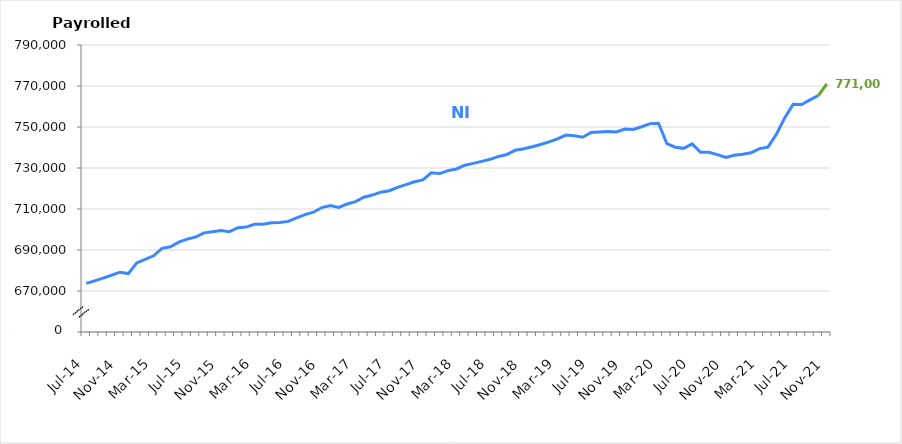
| Category | NI |
|---|---|
| Jul-14 | 673703 |
| Aug-14 | 674930 |
| Sep-14 | 676249 |
| Oct-14 | 677675 |
| Nov-14 | 679171 |
| Dec-14 | 678496 |
| Jan-15 | 683704 |
| Feb-15 | 685455 |
| Mar-15 | 687153 |
| Apr-15 | 690822 |
| May-15 | 691577 |
| Jun-15 | 693850 |
| Jul-15 | 695287 |
| Aug-15 | 696341 |
| Sep-15 | 698351 |
| Oct-15 | 698898 |
| Nov-15 | 699498 |
| Dec-15 | 698883 |
| Jan-16 | 700820 |
| Feb-16 | 701162 |
| Mar-16 | 702517 |
| Apr-16 | 702549 |
| May-16 | 703253 |
| Jun-16 | 703400 |
| Jul-16 | 703961 |
| Aug-16 | 705719 |
| Sep-16 | 707272 |
| Oct-16 | 708427 |
| Nov-16 | 710712 |
| Dec-16 | 711656 |
| Jan-17 | 710777 |
| Feb-17 | 712431 |
| Mar-17 | 713578 |
| Apr-17 | 715750 |
| May-17 | 716805 |
| Jun-17 | 718207 |
| Jul-17 | 718918 |
| Aug-17 | 720530 |
| Sep-17 | 721855 |
| Oct-17 | 723308 |
| Nov-17 | 724206 |
| Dec-17 | 727624 |
| Jan-18 | 727293 |
| Feb-18 | 728735 |
| Mar-18 | 729535 |
| Apr-18 | 731378 |
| May-18 | 732262 |
| Jun-18 | 733245 |
| Jul-18 | 734239 |
| Aug-18 | 735642 |
| Sep-18 | 736602 |
| Oct-18 | 738645 |
| Nov-18 | 739418 |
| Dec-18 | 740382 |
| Jan-19 | 741438 |
| Feb-19 | 742765 |
| Mar-19 | 744221 |
| Apr-19 | 746083 |
| May-19 | 745744 |
| Jun-19 | 744977 |
| Jul-19 | 747344 |
| Aug-19 | 747577 |
| Sep-19 | 747805 |
| Oct-19 | 747584 |
| Nov-19 | 748963 |
| Dec-19 | 748818 |
| Jan-20 | 750122 |
| Feb-20 | 751649 |
| Mar-20 | 751857 |
| Apr-20 | 741882 |
| May-20 | 740158 |
| Jun-20 | 739595 |
| Jul-20 | 741784 |
| Aug-20 | 737710 |
| Sep-20 | 737686 |
| Oct-20 | 736549 |
| Nov-20 | 735192 |
| Dec-20 | 736209 |
| Jan-21 | 736720 |
| Feb-21 | 737401 |
| Mar-21 | 739472 |
| Apr-21 | 740180 |
| May-21 | 746403 |
| Jun-21 | 754442 |
| Jul-21 | 761075 |
| Aug-21 | 760986 |
| Sep-21 | 763252 |
| Oct-21 | 765361 |
| Nov-21 | 771009 |